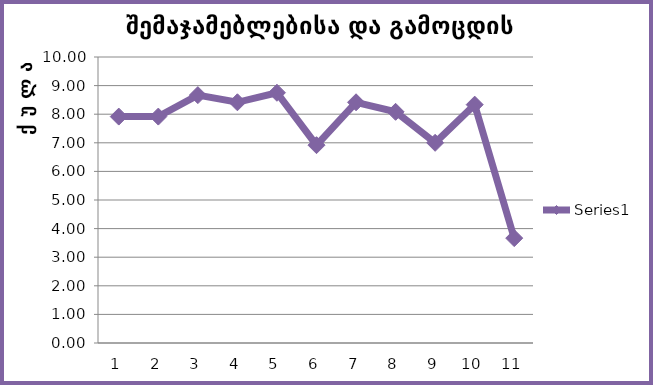
| Category | Series 0 |
|---|---|
| 0 | 7.917 |
| 1 | 7.917 |
| 2 | 8.667 |
| 3 | 8.417 |
| 4 | 8.75 |
| 5 | 6.917 |
| 6 | 8.417 |
| 7 | 8.083 |
| 8 | 7 |
| 9 | 8.333 |
| 10 | 3.667 |